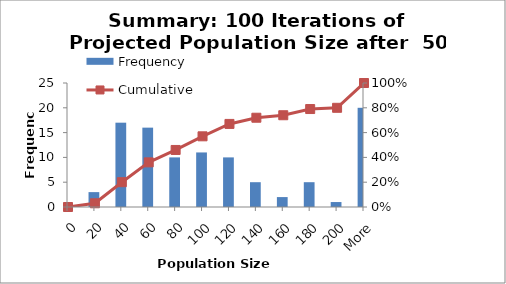
| Category | Frequency |
|---|---|
| 0 | 0 |
| 20 | 3 |
| 40 | 17 |
| 60 | 16 |
| 80 | 10 |
| 100 | 11 |
| 120 | 10 |
| 140 | 5 |
| 160 | 2 |
| 180 | 5 |
| 200 | 1 |
| More | 20 |